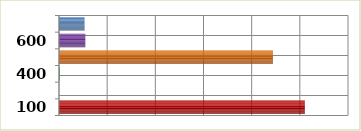
| Category | Series 0 |
|---|---|
| 100.0 | 2552075961.21 |
| 200.0 | 0 |
| 400.0 | 6398982.01 |
| 500.0 | 2221113227.83 |
| 600.0 | 273032905.5 |
| 700.0 | 265157611.45 |